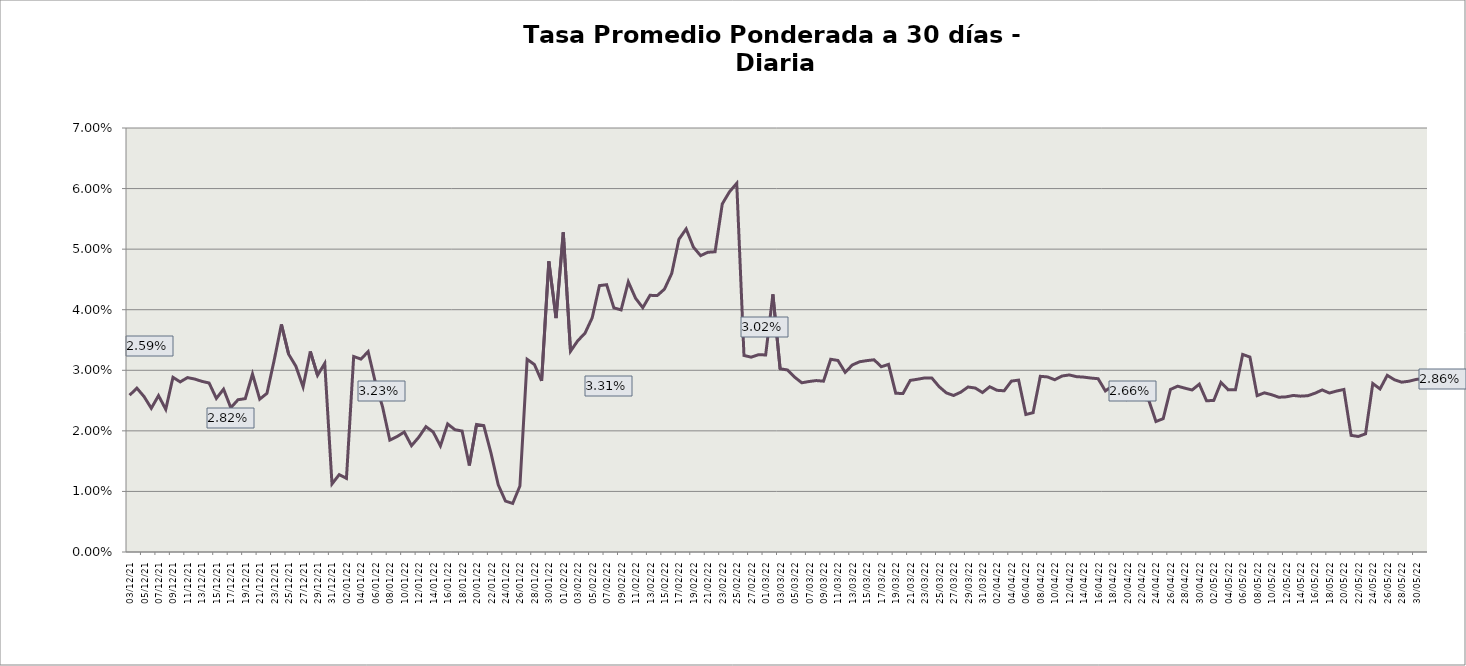
| Category | Tasa a 30 días |
|---|---|
| 2021-12-03 | 0.026 |
| 2021-12-04 | 0.027 |
| 2021-12-05 | 0.026 |
| 2021-12-06 | 0.024 |
| 2021-12-07 | 0.026 |
| 2021-12-08 | 0.024 |
| 2021-12-09 | 0.029 |
| 2021-12-10 | 0.028 |
| 2021-12-11 | 0.029 |
| 2021-12-12 | 0.029 |
| 2021-12-13 | 0.028 |
| 2021-12-14 | 0.028 |
| 2021-12-15 | 0.025 |
| 2021-12-16 | 0.027 |
| 2021-12-17 | 0.024 |
| 2021-12-18 | 0.025 |
| 2021-12-19 | 0.025 |
| 2021-12-20 | 0.029 |
| 2021-12-21 | 0.025 |
| 2021-12-22 | 0.026 |
| 2021-12-23 | 0.032 |
| 2021-12-24 | 0.038 |
| 2021-12-25 | 0.033 |
| 2021-12-26 | 0.031 |
| 2021-12-27 | 0.027 |
| 2021-12-28 | 0.033 |
| 2021-12-29 | 0.029 |
| 2021-12-30 | 0.031 |
| 2021-12-31 | 0.011 |
| 2022-01-01 | 0.013 |
| 2022-01-02 | 0.012 |
| 2022-01-03 | 0.032 |
| 2022-01-04 | 0.032 |
| 2022-01-05 | 0.033 |
| 2022-01-06 | 0.028 |
| 2022-01-07 | 0.024 |
| 2022-01-08 | 0.018 |
| 2022-01-09 | 0.019 |
| 2022-01-10 | 0.02 |
| 2022-01-11 | 0.018 |
| 2022-01-12 | 0.019 |
| 2022-01-13 | 0.021 |
| 2022-01-14 | 0.02 |
| 2022-01-15 | 0.018 |
| 2022-01-16 | 0.021 |
| 2022-01-17 | 0.02 |
| 2022-01-18 | 0.02 |
| 2022-01-19 | 0.014 |
| 2022-01-20 | 0.021 |
| 2022-01-21 | 0.021 |
| 2022-01-22 | 0.016 |
| 2022-01-23 | 0.011 |
| 2022-01-24 | 0.008 |
| 2022-01-25 | 0.008 |
| 2022-01-26 | 0.011 |
| 2022-01-27 | 0.032 |
| 2022-01-28 | 0.031 |
| 2022-01-29 | 0.028 |
| 2022-01-30 | 0.048 |
| 2022-01-31 | 0.039 |
| 2022-02-01 | 0.053 |
| 2022-02-02 | 0.033 |
| 2022-02-03 | 0.035 |
| 2022-02-04 | 0.036 |
| 2022-02-05 | 0.039 |
| 2022-02-06 | 0.044 |
| 2022-02-07 | 0.044 |
| 2022-02-08 | 0.04 |
| 2022-02-09 | 0.04 |
| 2022-02-10 | 0.045 |
| 2022-02-11 | 0.042 |
| 2022-02-12 | 0.04 |
| 2022-02-13 | 0.042 |
| 2022-02-14 | 0.042 |
| 2022-02-15 | 0.043 |
| 2022-02-16 | 0.046 |
| 2022-02-17 | 0.052 |
| 2022-02-18 | 0.053 |
| 2022-02-19 | 0.05 |
| 2022-02-20 | 0.049 |
| 2022-02-21 | 0.049 |
| 2022-02-22 | 0.05 |
| 2022-02-23 | 0.057 |
| 2022-02-24 | 0.059 |
| 2022-02-25 | 0.061 |
| 2022-02-26 | 0.032 |
| 2022-02-27 | 0.032 |
| 2022-02-28 | 0.033 |
| 2022-03-01 | 0.033 |
| 2022-03-02 | 0.043 |
| 2022-03-03 | 0.03 |
| 2022-03-04 | 0.03 |
| 2022-03-05 | 0.029 |
| 2022-03-06 | 0.028 |
| 2022-03-07 | 0.028 |
| 2022-03-08 | 0.028 |
| 2022-03-09 | 0.028 |
| 2022-03-10 | 0.032 |
| 2022-03-11 | 0.032 |
| 2022-03-12 | 0.03 |
| 2022-03-13 | 0.031 |
| 2022-03-14 | 0.031 |
| 2022-03-15 | 0.032 |
| 2022-03-16 | 0.032 |
| 2022-03-17 | 0.031 |
| 2022-03-18 | 0.031 |
| 2022-03-19 | 0.026 |
| 2022-03-20 | 0.026 |
| 2022-03-21 | 0.028 |
| 2022-03-22 | 0.029 |
| 2022-03-23 | 0.029 |
| 2022-03-24 | 0.029 |
| 2022-03-25 | 0.027 |
| 2022-03-26 | 0.026 |
| 2022-03-27 | 0.026 |
| 2022-03-28 | 0.026 |
| 2022-03-29 | 0.027 |
| 2022-03-30 | 0.027 |
| 2022-03-31 | 0.026 |
| 2022-04-01 | 0.027 |
| 2022-04-02 | 0.027 |
| 2022-04-03 | 0.027 |
| 2022-04-04 | 0.028 |
| 2022-04-05 | 0.028 |
| 2022-04-06 | 0.023 |
| 2022-04-07 | 0.023 |
| 2022-04-08 | 0.029 |
| 2022-04-09 | 0.029 |
| 2022-04-10 | 0.028 |
| 2022-04-11 | 0.029 |
| 2022-04-12 | 0.029 |
| 2022-04-13 | 0.029 |
| 2022-04-14 | 0.029 |
| 2022-04-15 | 0.029 |
| 2022-04-16 | 0.029 |
| 2022-04-17 | 0.027 |
| 2022-04-18 | 0.027 |
| 2022-04-19 | 0.027 |
| 2022-04-20 | 0.025 |
| 2022-04-21 | 0.026 |
| 2022-04-22 | 0.025 |
| 2022-04-23 | 0.025 |
| 2022-04-24 | 0.022 |
| 2022-04-25 | 0.022 |
| 2022-04-26 | 0.027 |
| 2022-04-27 | 0.027 |
| 2022-04-28 | 0.027 |
| 2022-04-29 | 0.027 |
| 2022-04-30 | 0.028 |
| 2022-05-01 | 0.025 |
| 2022-05-02 | 0.025 |
| 2022-05-03 | 0.028 |
| 2022-05-04 | 0.027 |
| 2022-05-05 | 0.027 |
| 2022-05-06 | 0.033 |
| 2022-05-07 | 0.032 |
| 2022-05-08 | 0.026 |
| 2022-05-09 | 0.026 |
| 2022-05-10 | 0.026 |
| 2022-05-11 | 0.026 |
| 2022-05-12 | 0.026 |
| 2022-05-13 | 0.026 |
| 2022-05-14 | 0.026 |
| 2022-05-15 | 0.026 |
| 2022-05-16 | 0.026 |
| 2022-05-17 | 0.027 |
| 2022-05-18 | 0.026 |
| 2022-05-19 | 0.027 |
| 2022-05-20 | 0.027 |
| 2022-05-21 | 0.019 |
| 2022-05-22 | 0.019 |
| 2022-05-23 | 0.02 |
| 2022-05-24 | 0.028 |
| 2022-05-25 | 0.027 |
| 2022-05-26 | 0.029 |
| 2022-05-27 | 0.028 |
| 2022-05-28 | 0.028 |
| 2022-05-29 | 0.028 |
| 2022-05-30 | 0.028 |
| 2022-05-31 | 0.029 |